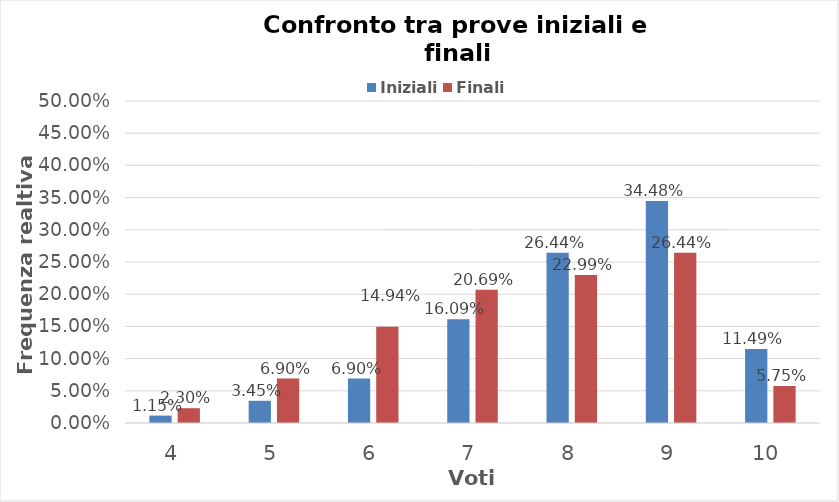
| Category | Iniziali | Finali |
|---|---|---|
| 4.0 | 0.011 | 0.023 |
| 5.0 | 0.034 | 0.069 |
| 6.0 | 0.069 | 0.149 |
| 7.0 | 0.161 | 0.207 |
| 8.0 | 0.264 | 0.23 |
| 9.0 | 0.345 | 0.264 |
| 10.0 | 0.115 | 0.057 |